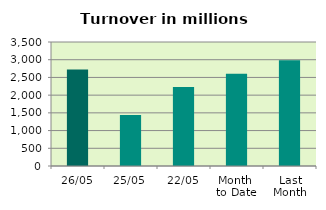
| Category | Series 0 |
|---|---|
| 26/05 | 2722.969 |
| 25/05 | 1440.76 |
| 22/05 | 2231.519 |
| Month 
to Date | 2604.252 |
| Last
Month | 2985.476 |